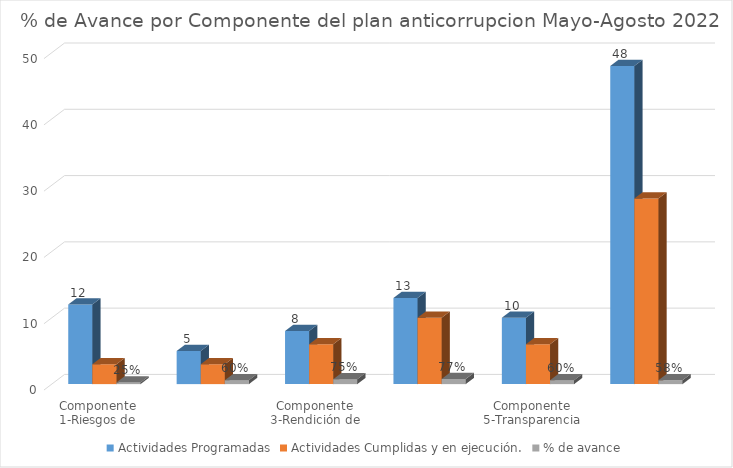
| Category | Actividades Programadas | Actividades Cumplidas y en ejecución. | % de avance |
|---|---|---|---|
| Componente 1-Riesgos de corrupción  | 12 | 3 | 0.25 |
| Componente 2-Antitramites  | 5 | 3 | 0.6 |
| Componente 3-Rendición de cuentas | 8 | 6 | 0.75 |
| Componente 4-Servicio al cuidadano | 13 | 10 | 0.769 |
| Componente 5-Transparencia y Acceso a la información. | 10 | 6 | 0.6 |
| TOTAL | 48 | 28 | 0.583 |